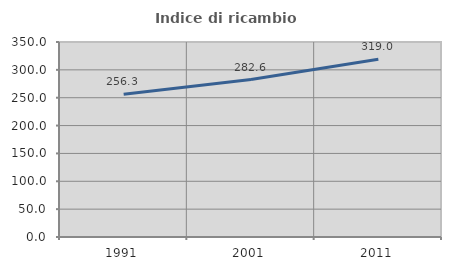
| Category | Indice di ricambio occupazionale  |
|---|---|
| 1991.0 | 256.25 |
| 2001.0 | 282.609 |
| 2011.0 | 319.048 |